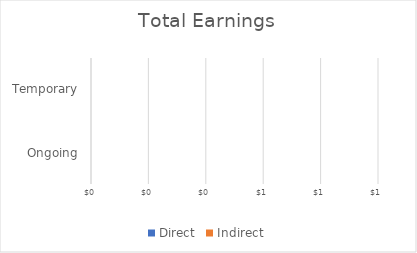
| Category | Direct | Indirect |
|---|---|---|
| Ongoing | 0 | 0 |
| Temporary | 0 | 0 |